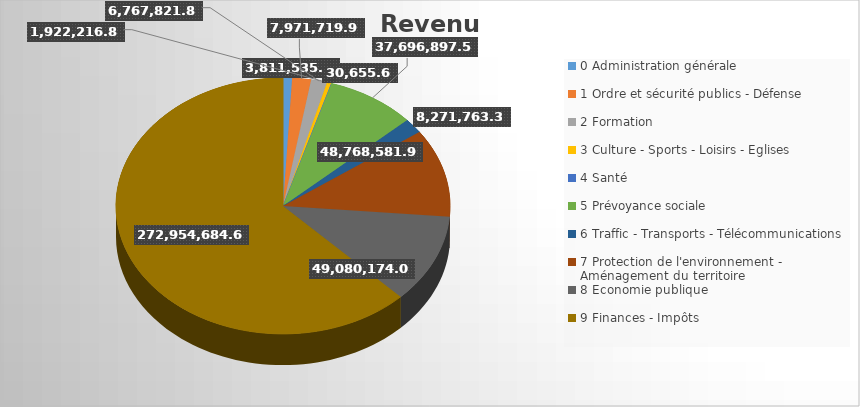
| Category | Series 0 |
|---|---|
| 0 Administration générale | 3811535.22 |
| 1 Ordre et sécurité publics - Défense | 7971719.96 |
| 2 Formation | 6767821.83 |
| 3 Culture - Sports - Loisirs - Eglises | 1922216.81 |
| 4 Santé | 30655.65 |
| 5 Prévoyance sociale | 37696897.57 |
| 6 Traffic - Transports - Télécommunications | 8271763.36 |
| 7 Protection de l'environnement - Aménagement du territoire | 48768581.91 |
| 8 Economie publique | 49080174.01 |
| 9 Finances - Impôts | 272954684.68 |